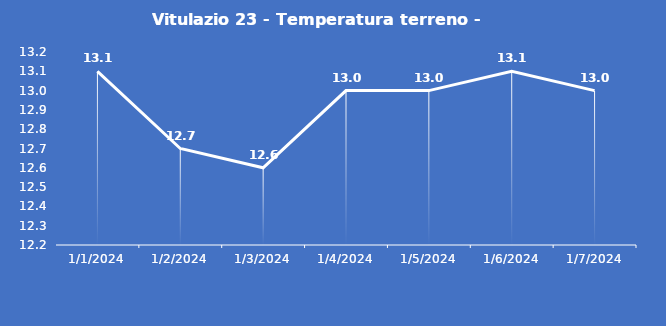
| Category | Vitulazio 23 - Temperatura terreno - Grezzo (°C) |
|---|---|
| 1/1/24 | 13.1 |
| 1/2/24 | 12.7 |
| 1/3/24 | 12.6 |
| 1/4/24 | 13 |
| 1/5/24 | 13 |
| 1/6/24 | 13.1 |
| 1/7/24 | 13 |